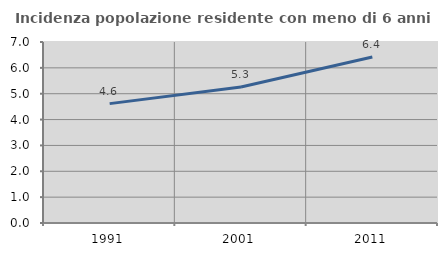
| Category | Incidenza popolazione residente con meno di 6 anni |
|---|---|
| 1991.0 | 4.617 |
| 2001.0 | 5.258 |
| 2011.0 | 6.419 |